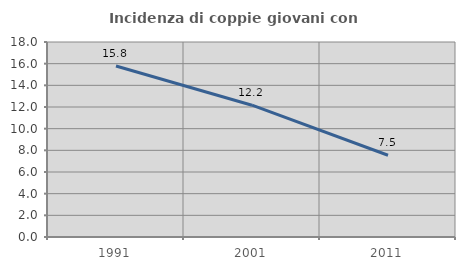
| Category | Incidenza di coppie giovani con figli |
|---|---|
| 1991.0 | 15.789 |
| 2001.0 | 12.165 |
| 2011.0 | 7.547 |